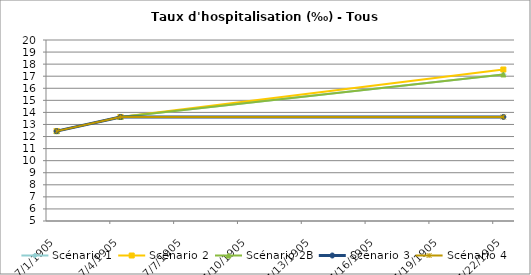
| Category | Scénario 1 | Scénario 2 | Scénario 2B | Scénario 3 | Scénario 4 |
|---|---|---|---|---|---|
| 2009.0 | 12.449 | 12.449 | 12.449 | 12.449 | 12.449 |
| 2012.0 | 13.622 | 13.622 | 13.622 | 13.622 | 13.622 |
| 2030.0 | 17.145 | 17.554 | 17.145 | 13.622 | 13.622 |